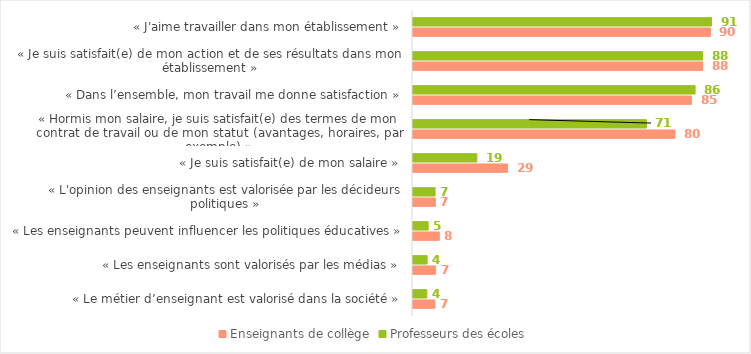
| Category | Enseignants de collège | Professeurs des écoles |
|---|---|---|
| « Le métier d’enseignant est valorisé dans la société » | 6.642 | 4.201 |
| « Les enseignants sont valorisés par les médias » | 6.888 | 4.292 |
| « Les enseignants peuvent influencer les politiques éducatives » | 7.999 | 4.609 |
| « L'opinion des enseignants est valorisée par les décideurs politiques » | 6.797 | 6.72 |
| « Je suis satisfait(e) de mon salaire » | 28.731 | 19.409 |
| « Hormis mon salaire, je suis satisfait(e) des termes de mon contrat de travail ou de mon statut (avantages, horaires, par exemple) » | 79.635 | 70.959 |
| « Dans l’ensemble, mon travail me donne satisfaction » | 84.658 | 85.747 |
| « Je suis satisfait(e) de mon action et de ses résultats dans mon établissement » | 88 | 88 |
| « J'aime travailler dans mon établissement » | 90.41 | 90.735 |